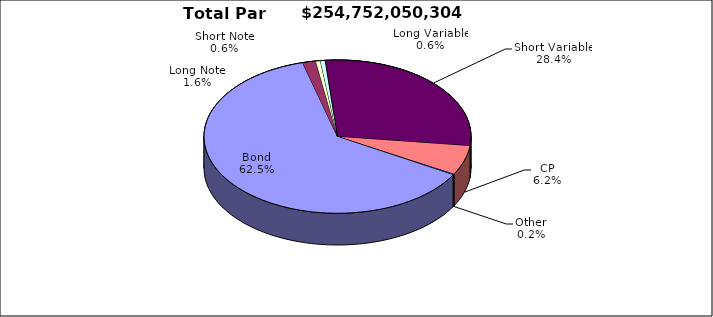
| Category | Par Value |
|---|---|
| Bond | 159117420045 |
| Long Note | 4075396392 |
| Short Note | 1432398569 |
| Long Variable | 1447598349 |
| Short Variable | 72360824226 |
| CP | 15879695000 |
| Other | 438717723 |